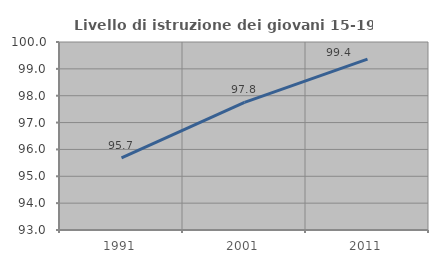
| Category | Livello di istruzione dei giovani 15-19 anni |
|---|---|
| 1991.0 | 95.683 |
| 2001.0 | 97.753 |
| 2011.0 | 99.363 |